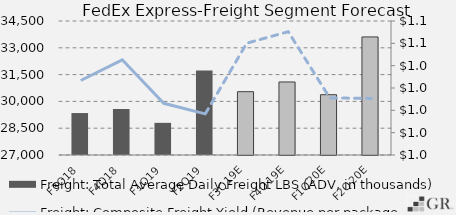
| Category | Freight: Total Average Daily Freight LBS (ADV, in thousands) |
|---|---|
|  F3Q18  | 29347.8 |
|  F4Q18  | 29576 |
|  F1Q19  | 28800 |
|  F2Q19  | 31733.7 |
|  F3Q19E  | 30543.763 |
|  F4Q19E  | 31087.589 |
|  F1Q20E  | 30374.843 |
|  F2Q20E  | 33608.028 |